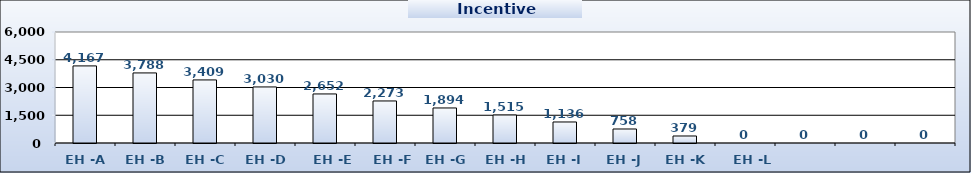
| Category | Series 0 |
|---|---|
| EH -A | 4166.667 |
| EH -B | 3787.879 |
| EH -C | 3409.091 |
| EH -D | 3030.303 |
| EH -E | 2651.515 |
| EH -F | 2272.727 |
| EH -G | 1893.939 |
| EH -H | 1515.152 |
| EH -I | 1136.364 |
| EH -J | 757.576 |
| EH -K | 378.788 |
| EH -L | 0 |
|   | 0 |
|   | 0 |
|   | 0 |